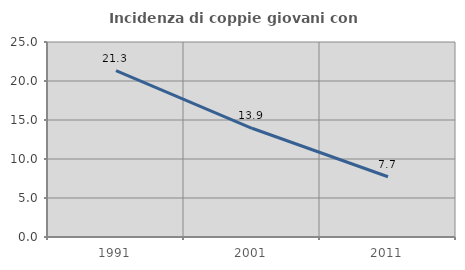
| Category | Incidenza di coppie giovani con figli |
|---|---|
| 1991.0 | 21.318 |
| 2001.0 | 13.939 |
| 2011.0 | 7.721 |